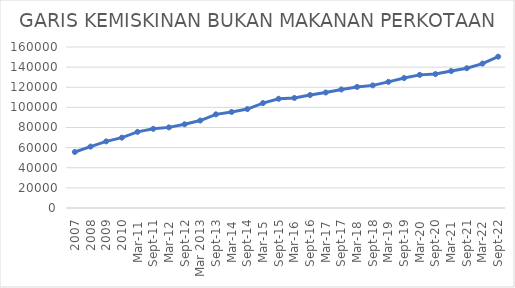
| Category | GARIS KEMISKINAN BUKAN MAKANAN PERKOTAAN |
|---|---|
| 2007 | 55683 |
| 2008 | 60999 |
| 2009 | 66214 |
| 2010 | 69912 |
| Mar-11 | 75674 |
| Sep-11 | 78675 |
| Mar-12 | 80123 |
| Sep-12 | 83175 |
| Mar 2013 | 86904 |
| Sep-13 | 93076 |
| Mar-14 | 95423 |
| Sep-14 | 98319 |
| Mar-15 | 104263 |
| Sep-15 | 108538 |
| Mar-16 | 109346 |
| Sep-16 | 112228 |
| Mar-17 | 114765 |
| Sep-17 | 117775 |
| Mar-18 | 120342 |
| Sep-18 | 121860.22 |
| Mar-19 | 125375 |
| Sep-19 | 129160 |
| Mar-20 | 132303 |
| Sep-20 | 133121 |
| Mar-21 | 136081 |
| Sep-21 | 138894 |
| Mar-22 | 143536 |
| Sep-22 | 150380 |